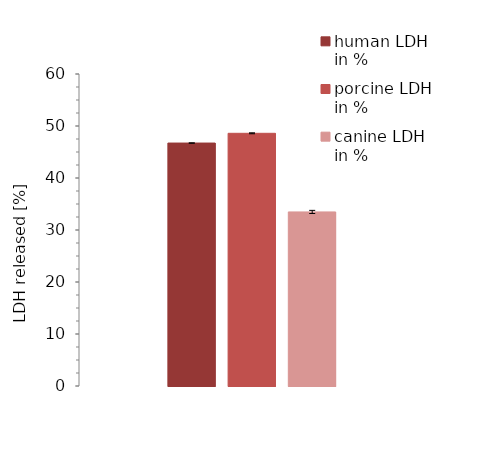
| Category | human LDH in % | porcine LDH in % | canine LDH in % |
|---|---|---|---|
| 0 | 46.72 | 48.596 | 33.475 |